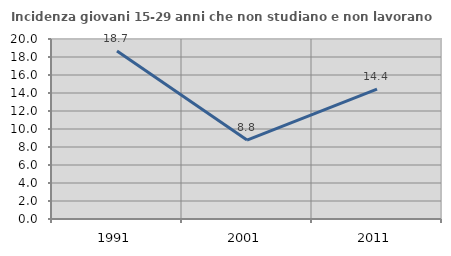
| Category | Incidenza giovani 15-29 anni che non studiano e non lavorano  |
|---|---|
| 1991.0 | 18.667 |
| 2001.0 | 8.766 |
| 2011.0 | 14.426 |